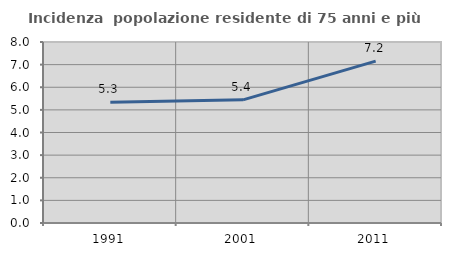
| Category | Incidenza  popolazione residente di 75 anni e più |
|---|---|
| 1991.0 | 5.336 |
| 2001.0 | 5.444 |
| 2011.0 | 7.155 |